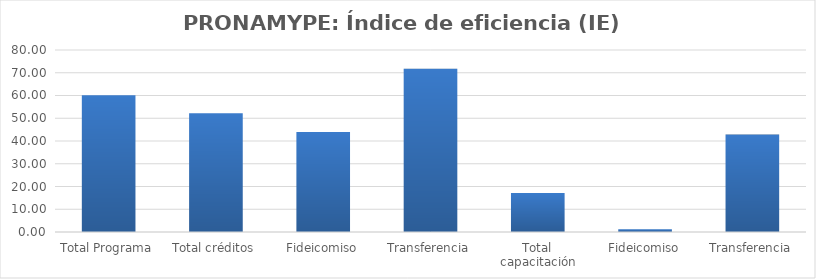
| Category | Índice de eficiencia (IE)  |
|---|---|
| Total Programa | 60.086 |
| Total créditos | 52.214 |
| Fideicomiso | 43.948 |
| Transferencia | 71.753 |
| Total capacitación | 17.151 |
| Fideicomiso | 1.236 |
| Transferencia | 42.818 |